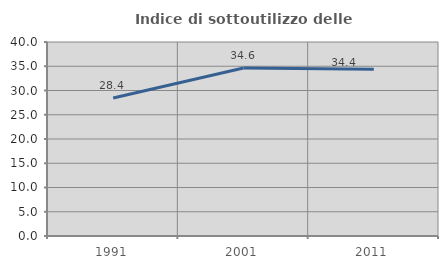
| Category | Indice di sottoutilizzo delle abitazioni  |
|---|---|
| 1991.0 | 28.442 |
| 2001.0 | 34.627 |
| 2011.0 | 34.381 |